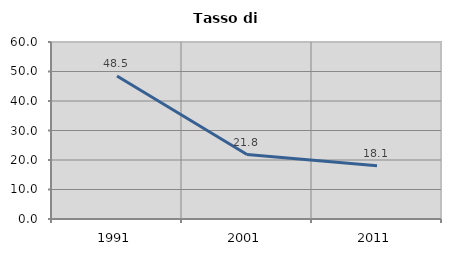
| Category | Tasso di disoccupazione   |
|---|---|
| 1991.0 | 48.488 |
| 2001.0 | 21.846 |
| 2011.0 | 18.052 |